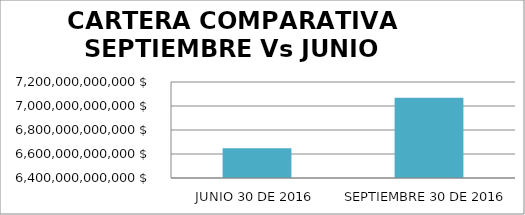
| Category | Series 0 |
|---|---|
| JUNIO 30 DE 2016 | 6647009005143 |
| SEPTIEMBRE 30 DE 2016 | 7068378037844 |